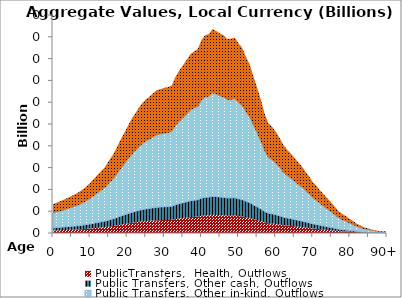
| Category | PublicTransfers,  Health, Outflows | Public Transfers, Other cash, Outflows | Public Transfers, Other in-kind, Outflows | Public Transfers, Education, Outflows |
|---|---|---|---|---|
| 0 | 0.237 | 0.242 | 1.343 | 0.833 |
|  | 0.249 | 0.254 | 1.409 | 0.874 |
| 2 | 0.261 | 0.266 | 1.479 | 0.917 |
| 3 | 0.274 | 0.28 | 1.554 | 0.964 |
| 4 | 0.289 | 0.294 | 1.635 | 1.014 |
| 5 | 0.304 | 0.31 | 1.721 | 1.068 |
| 6 | 0.318 | 0.324 | 1.801 | 1.117 |
| 7 | 0.335 | 0.342 | 1.9 | 1.179 |
| 8 | 0.356 | 0.363 | 2.018 | 1.252 |
| 9 | 0.382 | 0.389 | 2.162 | 1.341 |
| 10 | 0.41 | 0.418 | 2.323 | 1.441 |
| 11 | 0.443 | 0.452 | 2.509 | 1.556 |
| 12 | 0.477 | 0.486 | 2.702 | 1.676 |
| 13 | 0.508 | 0.518 | 2.877 | 1.784 |
| 14 | 0.54 | 0.551 | 3.061 | 1.899 |
| 15 | 0.59 | 0.602 | 3.343 | 2.074 |
| 16 | 0.633 | 0.646 | 3.589 | 2.226 |
| 17 | 0.689 | 0.703 | 3.904 | 2.422 |
| 18 | 0.752 | 0.767 | 4.259 | 2.642 |
| 19 | 0.81 | 0.826 | 4.588 | 2.846 |
| 20 | 0.867 | 0.884 | 4.91 | 3.045 |
| 21 | 0.924 | 0.943 | 5.235 | 3.248 |
| 22 | 0.973 | 0.993 | 5.515 | 3.421 |
| 23 | 1.019 | 1.04 | 5.775 | 3.582 |
| 24 | 1.062 | 1.084 | 6.019 | 3.733 |
| 25 | 1.094 | 1.116 | 6.198 | 3.844 |
| 26 | 1.116 | 1.139 | 6.326 | 3.924 |
| 27 | 1.146 | 1.169 | 6.492 | 4.027 |
| 28 | 1.17 | 1.193 | 6.626 | 4.11 |
| 29 | 1.179 | 1.203 | 6.682 | 4.145 |
| 30 | 1.189 | 1.213 | 6.736 | 4.178 |
| 31 | 1.195 | 1.219 | 6.772 | 4.201 |
| 32 | 1.21 | 1.234 | 6.853 | 4.251 |
| 33 | 1.279 | 1.304 | 7.245 | 4.494 |
| 34 | 1.33 | 1.357 | 7.535 | 4.674 |
| 35 | 1.373 | 1.401 | 7.78 | 4.826 |
| 36 | 1.417 | 1.446 | 8.03 | 4.981 |
| 37 | 1.463 | 1.493 | 8.291 | 5.143 |
| 38 | 1.488 | 1.517 | 8.429 | 5.228 |
| 39 | 1.507 | 1.537 | 8.54 | 5.297 |
| 40 | 1.579 | 1.611 | 8.948 | 5.55 |
| 41 | 1.622 | 1.654 | 9.189 | 5.7 |
| 42 | 1.629 | 1.661 | 9.228 | 5.724 |
| 43 | 1.67 | 1.704 | 9.464 | 5.871 |
| 44 | 1.654 | 1.687 | 9.373 | 5.814 |
| 45 | 1.634 | 1.666 | 9.256 | 5.741 |
| 46 | 1.62 | 1.653 | 9.179 | 5.694 |
| 47 | 1.589 | 1.621 | 9.005 | 5.586 |
| 48 | 1.593 | 1.624 | 9.023 | 5.597 |
| 49 | 1.6 | 1.632 | 9.067 | 5.624 |
| 50 | 1.554 | 1.585 | 8.802 | 5.46 |
| 51 | 1.515 | 1.545 | 8.583 | 5.324 |
| 52 | 1.443 | 1.472 | 8.174 | 5.07 |
| 53 | 1.382 | 1.41 | 7.83 | 4.857 |
| 54 | 1.284 | 1.31 | 7.274 | 4.512 |
| 55 | 1.19 | 1.214 | 6.744 | 4.184 |
| 56 | 1.093 | 1.115 | 6.193 | 3.841 |
| 57 | 0.981 | 1.001 | 5.558 | 3.447 |
| 58 | 0.9 | 0.918 | 5.099 | 3.163 |
| 59 | 0.872 | 0.89 | 4.943 | 3.066 |
| 60 | 0.83 | 0.846 | 4.701 | 2.916 |
| 61 | 0.783 | 0.799 | 4.436 | 2.752 |
| 62 | 0.726 | 0.74 | 4.111 | 2.55 |
| 63 | 0.685 | 0.699 | 3.883 | 2.409 |
| 64 | 0.653 | 0.666 | 3.702 | 2.296 |
| 65 | 0.619 | 0.631 | 3.505 | 2.174 |
| 66 | 0.581 | 0.593 | 3.294 | 2.043 |
| 67 | 0.548 | 0.559 | 3.105 | 1.926 |
| 68 | 0.504 | 0.514 | 2.853 | 1.77 |
| 69 | 0.465 | 0.474 | 2.635 | 1.635 |
| 70 | 0.417 | 0.426 | 2.364 | 1.466 |
| 71 | 0.385 | 0.393 | 2.183 | 1.354 |
| 72 | 0.348 | 0.355 | 1.974 | 1.224 |
| 73 | 0.315 | 0.321 | 1.783 | 1.106 |
| 74 | 0.28 | 0.286 | 1.589 | 0.986 |
| 75 | 0.249 | 0.254 | 1.409 | 0.874 |
| 76 | 0.213 | 0.217 | 1.206 | 0.748 |
| 77 | 0.178 | 0.182 | 1.009 | 0.626 |
| 78 | 0.156 | 0.159 | 0.884 | 0.548 |
| 79 | 0.136 | 0.139 | 0.772 | 0.479 |
| 80 | 0.115 | 0.118 | 0.654 | 0.405 |
| 81 | 0.094 | 0.096 | 0.534 | 0.331 |
| 82 | 0.074 | 0.076 | 0.42 | 0.261 |
| 83 | 0.059 | 0.06 | 0.332 | 0.206 |
| 84 | 0.045 | 0.046 | 0.256 | 0.159 |
| 85 | 0.037 | 0.037 | 0.207 | 0.129 |
| 86 | 0.028 | 0.029 | 0.159 | 0.098 |
| 87 | 0.021 | 0.021 | 0.119 | 0.074 |
| 88 | 0.015 | 0.016 | 0.086 | 0.054 |
| 89 | 0.011 | 0.011 | 0.061 | 0.038 |
| 90+ | 0.021 | 0.022 | 0.121 | 0.075 |